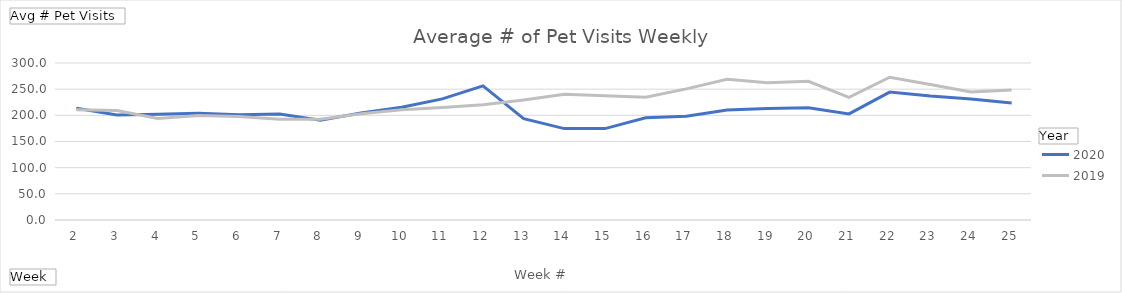
| Category | 2020 | 2019 |
|---|---|---|
| 2 | 213.43 | 210.452 |
| 3 | 200.753 | 209.086 |
| 4 | 202.054 | 193.785 |
| 5 | 204.022 | 199.763 |
| 6 | 201.086 | 197.86 |
| 7 | 202.344 | 192.688 |
| 8 | 190.839 | 192.753 |
| 9 | 204.602 | 202.839 |
| 10 | 215.419 | 210.581 |
| 11 | 231.495 | 214.871 |
| 12 | 256.312 | 220.323 |
| 13 | 193.656 | 229.473 |
| 14 | 174.602 | 240.215 |
| 15 | 174.634 | 237.591 |
| 16 | 195.409 | 234.409 |
| 17 | 198.452 | 250.613 |
| 18 | 210.215 | 268.925 |
| 19 | 213.086 | 262.237 |
| 20 | 214.634 | 265.097 |
| 21 | 202.656 | 234.204 |
| 22 | 244.419 | 272.86 |
| 23 | 236.774 | 259 |
| 24 | 231.075 | 244.602 |
| 25 | 223.753 | 248.495 |